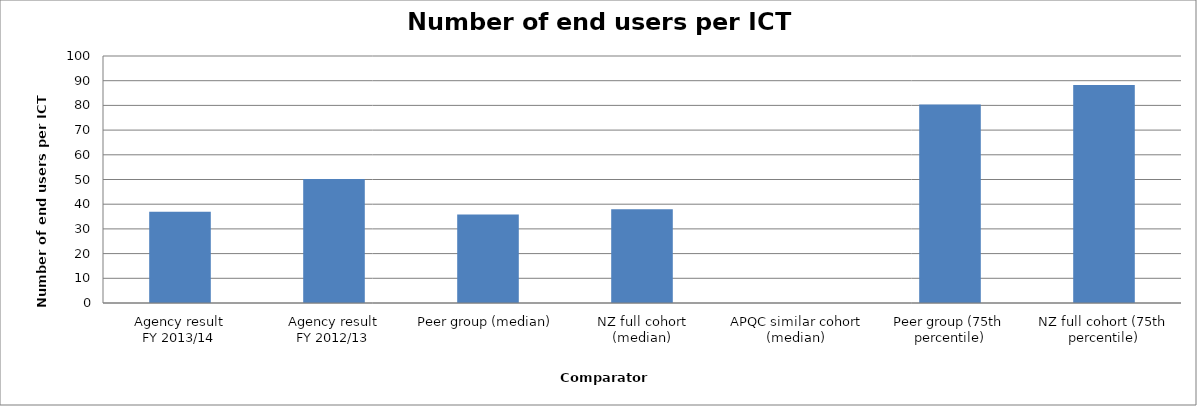
| Category | Result |
|---|---|
| Agency result
FY 2013/14 | 36.907 |
| Agency result
FY 2012/13 | 50.237 |
| Peer group (median) | 35.841 |
| NZ full cohort (median) | 37.909 |
| APQC similar cohort (median) | 0 |
| Peer group (75th percentile) | 80.375 |
| NZ full cohort (75th percentile) | 88.228 |